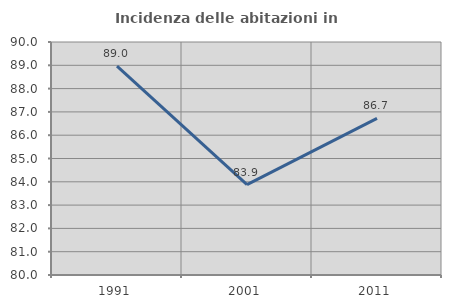
| Category | Incidenza delle abitazioni in proprietà  |
|---|---|
| 1991.0 | 88.966 |
| 2001.0 | 83.881 |
| 2011.0 | 86.721 |